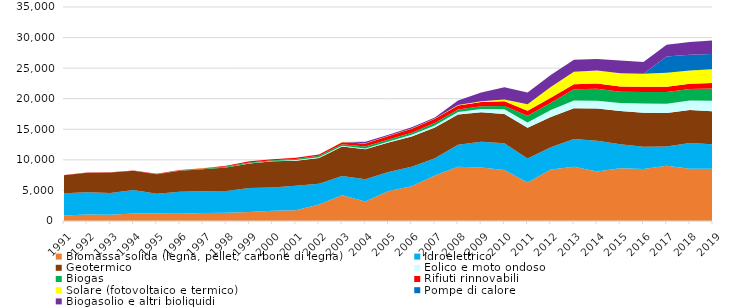
| Category | Biomassa solida (legna, pellet, carbone di legna) | Idroelettrico | Geotermico | Eolico e moto ondoso | Biogas | Rifiuti rinnovabili | Solare (fotovoltaico e termico) | Pompe di calore | Biogasolio e altri bioliquidi |
|---|---|---|---|---|---|---|---|---|---|
| 1991 | 909.119 | 3631.9 | 2936.658 | 0.258 | 2.914 | 23.813 | 5.9 | 0 | 0 |
| 1992 | 1070.221 | 3628.547 | 3190.217 | 0.172 | 4.06 | 21.496 | 6.888 | 0 | 0 |
| 1993 | 1012.826 | 3561.909 | 3366.007 | 0.344 | 3.607 | 23.001 | 7.705 | 0 | 0 |
| 1994 | 1219.929 | 3839.897 | 3151.046 | 0.602 | 10.032 | 24.506 | 7.825 | 0 | 0 |
| 1995 | 1209.587 | 3248.667 | 3167.383 | 0.774 | 22.619 | 62.1 | 8.116 | 0 | 0 |
| 1996 | 1167.598 | 3614.531 | 3447.693 | 2.837 | 46.981 | 66.877 | 8.322 | 0 | 0 |
| 1997 | 1304.361 | 3577.214 | 3570.651 | 10.146 | 97.784 | 85.985 | 8.527 | 0 | 0 |
| 1998 | 1353.11 | 3544.282 | 3836.343 | 19.862 | 142.424 | 136.381 | 11.025 | 0 | 0 |
| 1999 | 1492.261 | 3900.688 | 3998.854 | 34.652 | 148.514 | 187.16 | 11.279 | 0 | 0 |
| 2000 | 1695.094 | 3800.468 | 4258.527 | 48.409 | 130.888 | 167.001 | 12.439 | 0 | 0 |
| 2001 | 1752.713 | 4024.959 | 4092.457 | 101.376 | 157.184 | 198.648 | 13.743 | 0 | 0 |
| 2002 | 2699.909 | 3398.053 | 4225.733 | 120.722 | 216.036 | 213.122 | 15.802 | 0 | 0 |
| 2003 | 4202.035 | 3153.035 | 4809.568 | 125.365 | 255.35 | 345.777 | 18.138 | 0 | 0 |
| 2004 | 3190.356 | 3640.402 | 4888.172 | 158.774 | 318.931 | 493.05 | 20.981 | 0 | 252.747 |
| 2005 | 4926.746 | 3101.181 | 4791.177 | 201.496 | 323.851 | 555.532 | 29.99 | 0 | 176.746 |
| 2006 | 5690.036 | 3180.938 | 4965.63 | 255.437 | 358.866 | 640.704 | 37.809 | 0 | 197.072 |
| 2007 | 7453.955 | 2821.602 | 5001.552 | 346.892 | 387.886 | 700.033 | 55.561 | 0 | 178.513 |
| 2008 | 8872.313 | 3578.93 | 4959.563 | 417.998 | 409.979 | 639.056 | 83.469 | 0 | 745.87 |
| 2009 | 8741.932 | 4225.063 | 4806.105 | 562.585 | 426.65 | 685.989 | 143.101 | 0 | 1435.132 |
| 2010 | 8333.295 | 4395.251 | 4775.819 | 784.688 | 507.548 | 778.375 | 297.993 | 0 | 1991.333 |
| 2011 | 6287.174 | 3940.045 | 5015.143 | 847.496 | 1103.898 | 842.983 | 1068.659 | 0 | 1920.456 |
| 2012 | 8441.272 | 3600.593 | 4957.27 | 1152.805 | 1178.752 | 806.821 | 1777.162 | 0 | 1970.062 |
| 2013 | 8889.266 | 4537.695 | 5016.242 | 1280.908 | 1815.539 | 827.625 | 2024.482 | 0 | 1978.868 |
| 2014 | 8110.538 | 5034.002 | 5234.953 | 1305.1 | 1961.044 | 858.436 | 2097.59 | 0 | 1910.628 |
| 2015 | 8619.963 | 3915.505 | 5469.499 | 1276.344 | 1871.477 | 845.968 | 2162.675 | 0 | 2107.273 |
| 2016 | 8485.335 | 3648.474 | 5570.603 | 1520.952 | 1875.06 | 870.665 | 2100.825 | 0 | 1946.007 |
| 2017 | 9052.393 | 3112.529 | 5500.783 | 1525.53 | 1897.7 | 853.193 | 2305 | 2650.386 | 1923.581 |
| 2018 | 8556.356 | 4194.877 | 5419.745 | 1523.339 | 1892.15 | 846.629 | 2166.444 | 2596.156 | 2086.023 |
| 2019 | 8559.975 | 3982.677 | 5395.825 | 1737.063 | 2013.189 | 873.012 | 2264.987 | 2498.46 | 2186.94 |